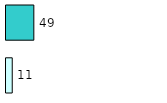
| Category | Series 0 | Series 1 |
|---|---|---|
| 0 | 11 | 49 |